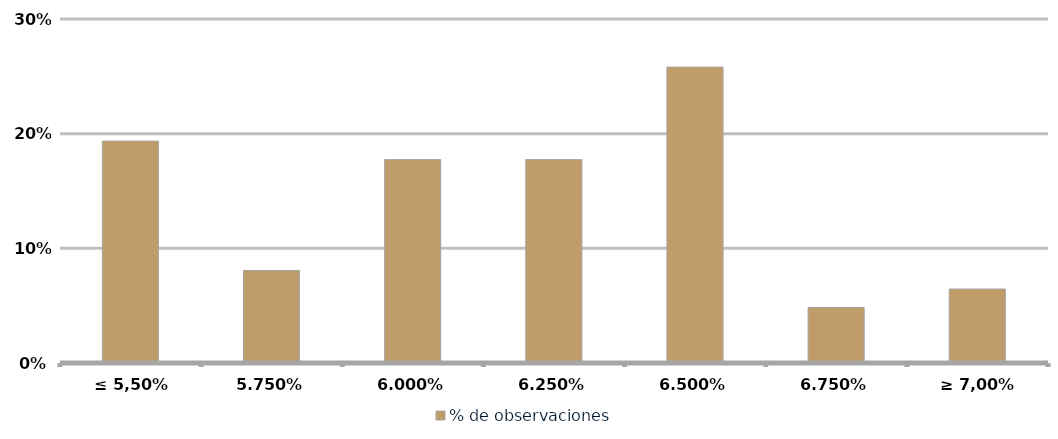
| Category | % de observaciones  |
|---|---|
| ≤ 5,50% | 0.194 |
| 5,75% | 0.081 |
| 6,00% | 0.177 |
| 6,25% | 0.177 |
| 6,50% | 0.258 |
| 6,75% | 0.048 |
| ≥ 7,00% | 0.065 |